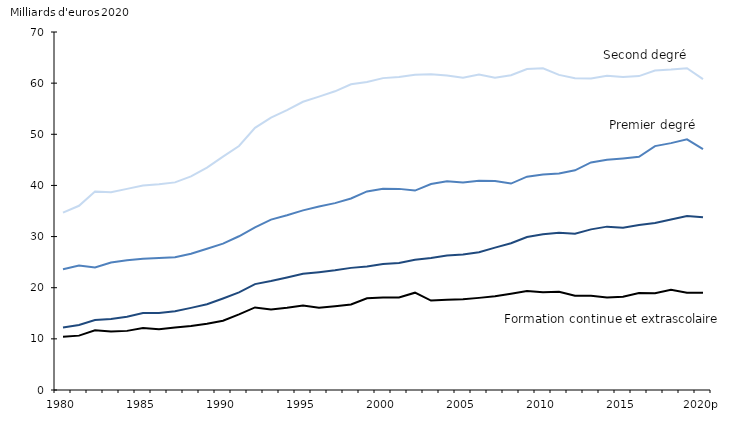
| Category | Premier degré | Second degré | Supérieur | Formation continue et extrascolaire |
|---|---|---|---|---|
| 1980 | 23.603 | 34.689 | 12.235 | 10.412 |
| 1981 | 24.32 | 36.023 | 12.714 | 10.632 |
| 1982 | 23.944 | 38.803 | 13.68 | 11.663 |
| 1983 | 24.937 | 38.669 | 13.871 | 11.441 |
| 1984 | 25.392 | 39.33 | 14.342 | 11.56 |
| 1985 | 25.672 | 39.995 | 15.049 | 12.123 |
| 1986 | 25.808 | 40.236 | 15.068 | 11.886 |
| 1987 | 25.955 | 40.596 | 15.41 | 12.215 |
| 1988 | 26.636 | 41.773 | 16.056 | 12.536 |
| 1989 | 27.616 | 43.474 | 16.757 | 12.955 |
| 1990 | 28.615 | 45.618 | 17.896 | 13.549 |
| 1991 | 30.061 | 47.714 | 19.098 | 14.795 |
| 1992 | 31.814 | 51.26 | 20.703 | 16.15 |
| 1993 | 33.309 | 53.259 | 21.307 | 15.759 |
| 1994 | 34.171 | 54.714 | 22.008 | 16.09 |
| 1995 | 35.125 | 56.354 | 22.743 | 16.503 |
| 1996 | 35.884 | 57.361 | 23.039 | 16.105 |
| 1997 | 36.536 | 58.402 | 23.404 | 16.383 |
| 1998 | 37.443 | 59.769 | 23.88 | 16.715 |
| 1999 | 38.821 | 60.211 | 24.157 | 17.923 |
| 2000 | 39.334 | 60.981 | 24.619 | 18.095 |
| 2001 | 39.326 | 61.203 | 24.835 | 18.104 |
| 2002 | 38.996 | 61.663 | 25.458 | 19.029 |
| 2003 | 40.279 | 61.72 | 25.819 | 17.486 |
| 2004 | 40.806 | 61.49 | 26.296 | 17.623 |
| 2005 | 40.587 | 61.068 | 26.478 | 17.734 |
| 2006 | 40.928 | 61.693 | 26.94 | 18.013 |
| 2007 | 40.851 | 61.057 | 27.84 | 18.338 |
| 2008 | 40.366 | 61.535 | 28.698 | 18.819 |
| 2009 | 41.71 | 62.746 | 29.926 | 19.362 |
| 2010 | 42.119 | 62.91 | 30.44 | 19.098 |
| 2011 | 42.352 | 61.616 | 30.748 | 19.221 |
| 2012 | 42.963 | 60.959 | 30.565 | 18.436 |
| 2013 | 44.503 | 60.898 | 31.406 | 18.405 |
| 2014 | 45.034 | 61.433 | 31.942 | 18.107 |
| 2015 | 45.279 | 61.188 | 31.708 | 18.244 |
| 2016 | 45.59 | 61.374 | 32.249 | 18.97 |
| 2017 | 47.69 | 62.475 | 32.64 | 18.942 |
| 2018 | 48.268 | 62.645 | 33.353 | 19.59 |
| 2019 | 49.011 | 62.92 | 34.036 | 19.036 |
| 2020p | 47.095 | 60.776 | 33.761 | 19.01 |